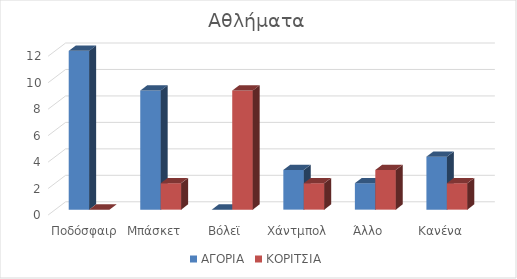
| Category | ΑΓΟΡΙΑ | ΚΟΡΙΤΣΙΑ |
|---|---|---|
| Ποδόσφαιρο | 12 | 0 |
| Μπάσκετ | 9 | 2 |
| Βόλεϊ | 0 | 9 |
| Χάντμπολ | 3 | 2 |
| Άλλο | 2 | 3 |
| Κανένα | 4 | 2 |